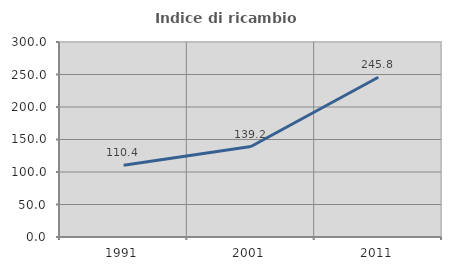
| Category | Indice di ricambio occupazionale  |
|---|---|
| 1991.0 | 110.442 |
| 2001.0 | 139.212 |
| 2011.0 | 245.812 |